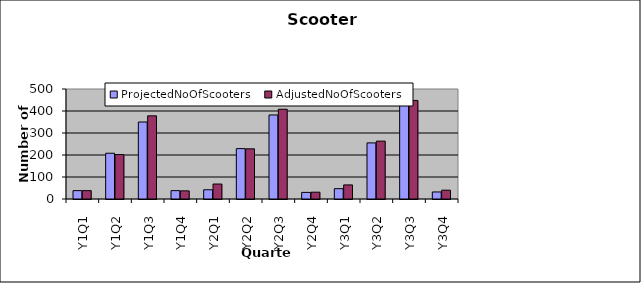
| Category | ProjectedNoOfScooters | AdjustedNoOfScooters |
|---|---|---|
| Y1Q1 | 38 | 38 |
| Y1Q2 | 208 | 202 |
| Y1Q3 | 350 | 378 |
| Y1Q4 | 38 | 37 |
| Y2Q1 | 42 | 68 |
| Y2Q2 | 229 | 228 |
| Y2Q3 | 382 | 408 |
| Y2Q4 | 30 | 31 |
| Y3Q1 | 47 | 64 |
| Y3Q2 | 255 | 263 |
| Y3Q3 | 431 | 448 |
| Y3Q4 | 32 | 40 |